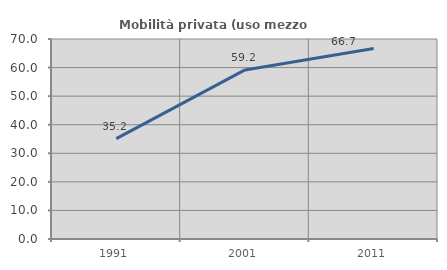
| Category | Mobilità privata (uso mezzo privato) |
|---|---|
| 1991.0 | 35.156 |
| 2001.0 | 59.174 |
| 2011.0 | 66.667 |